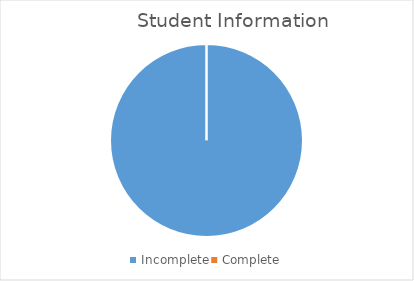
| Category | 100% |
|---|---|
| Incomplete | 1 |
| Complete | 0 |